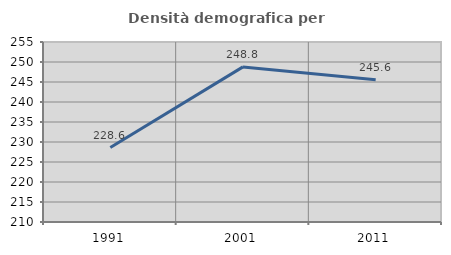
| Category | Densità demografica |
|---|---|
| 1991.0 | 228.602 |
| 2001.0 | 248.777 |
| 2011.0 | 245.584 |